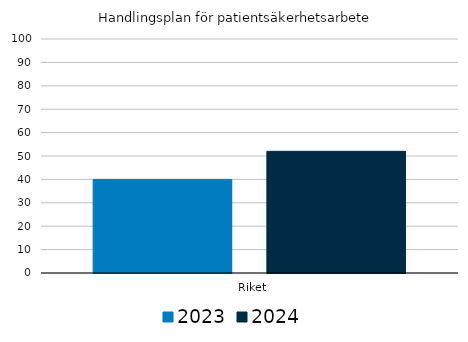
| Category | 2023 | 2024 |
|---|---|---|
|   Riket | 40 | 52 |